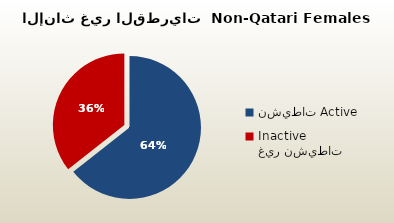
| Category | الاناث غير القطريات  Non-Qatari Females |
|---|---|
| نشيطات Active | 254219 |
| غير نشيطات Inactive | 140544 |